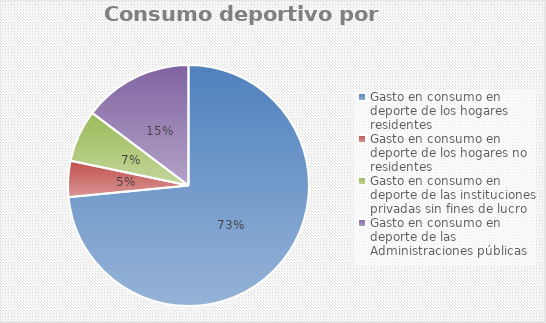
| Category | Series 0 |
|---|---|
| Gasto en consumo en deporte de los hogares residentes | 2979503.89 |
| Gasto en consumo en deporte de los hogares no residentes | 196073.293 |
| Gasto en consumo en deporte de las instituciones privadas sin fines de lucro | 283712.895 |
| Gasto en consumo en deporte de las Administraciones públicas | 597044.206 |